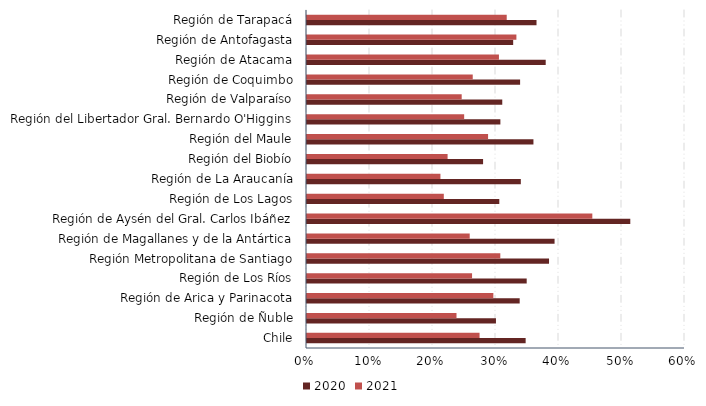
| Category | 2020 | 2021 |
|---|---|---|
| Chile | 0.347 | 0.274 |
| Región de Ñuble | 0.3 | 0.237 |
| Región de Arica y Parinacota | 0.338 | 0.296 |
| Región de Los Ríos | 0.349 | 0.262 |
| Región Metropolitana de Santiago | 0.384 | 0.307 |
| Región de Magallanes y de la Antártica | 0.393 | 0.258 |
| Región de Aysén del Gral. Carlos Ibáñez | 0.513 | 0.453 |
| Región de Los Lagos | 0.305 | 0.217 |
| Región de La Araucanía | 0.339 | 0.212 |
| Región del Biobío | 0.279 | 0.223 |
| Región del Maule | 0.359 | 0.287 |
| Región del Libertador Gral. Bernardo O'Higgins | 0.307 | 0.249 |
| Región de Valparaíso | 0.31 | 0.246 |
| Región de Coquimbo | 0.338 | 0.263 |
| Región de Atacama | 0.379 | 0.305 |
| Región de Antofagasta | 0.327 | 0.332 |
| Región de Tarapacá | 0.364 | 0.317 |